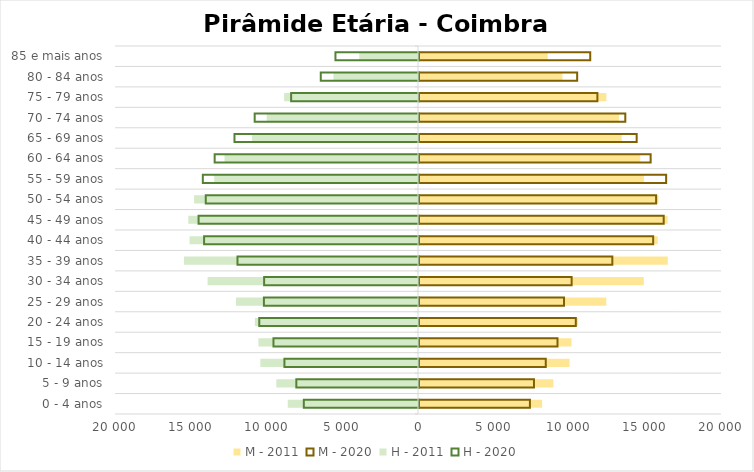
| Category | M - 2011 | M - 2020 | H - 2011 | H - 2020 |
|---|---|---|---|---|
| 0 - 4 anos | 8128 | 7321 | -8596 | -7603 |
| 5 - 9 anos | 8870 | 7588 | -9353 | -8097 |
| 10 - 14 anos | 9940 | 8367 | -10405 | -8883 |
| 15 - 19 anos | 10070 | 9141 | -10533 | -9606 |
| 20 - 24 anos | 10503 | 10350 | -10767 | -10544 |
| 25 - 29 anos | 12363 | 9572 | -12013 | -10237 |
| 30 - 34 anos | 14838 | 10075 | -13888 | -10223 |
| 35 - 39 anos | 16424 | 12761 | -15444 | -11982 |
| 40 - 44 anos | 15761 | 15457 | -15077 | -14186 |
| 45 - 49 anos | 16408 | 16152 | -15160 | -14550 |
| 50 - 54 anos | 15802 | 15651 | -14778 | -14075 |
| 55 - 59 anos | 14847 | 16313 | -13452 | -14269 |
| 60 - 64 anos | 14604 | 15290 | -12773 | -13488 |
| 65 - 69 anos | 13385 | 14367 | -10957 | -12180 |
| 70 - 74 anos | 13199 | 13617 | -9986 | -10846 |
| 75 - 79 anos | 12366 | 11775 | -8837 | -8440 |
| 80 - 84 anos | 9467 | 10440 | -5582 | -6484 |
| 85 e mais anos | 8499 | 11302 | -3877 | -5515 |